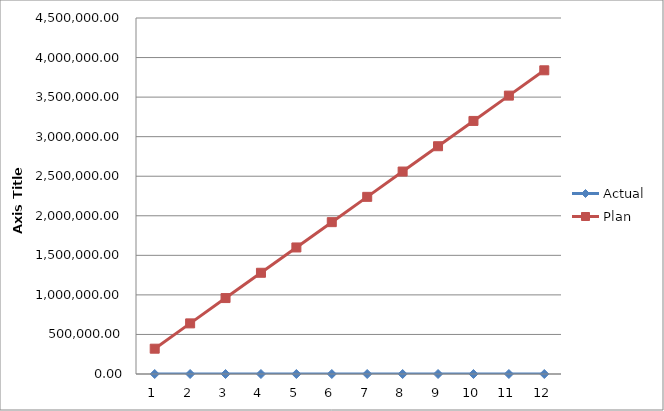
| Category | Actual | Plan |
|---|---|---|
| 0 | 0 | 319897.833 |
| 1 | 0 | 639795.667 |
| 2 | 0 | 959693.5 |
| 3 | 0 | 1279591.333 |
| 4 | 0 | 1599489.167 |
| 5 | 0 | 1919387 |
| 6 | 0 | 2239284.833 |
| 7 | 0 | 2559182.667 |
| 8 | 0 | 2879080.5 |
| 9 | 0 | 3198978.333 |
| 10 | 0 | 3518876.167 |
| 11 | 0 | 3838774 |